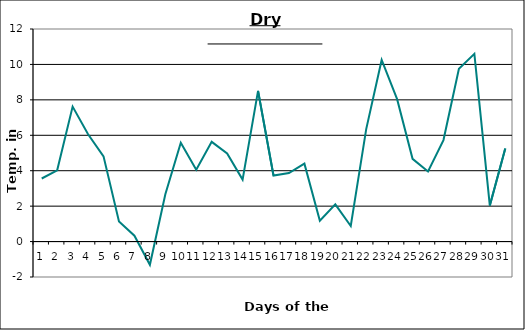
| Category | Series 0 |
|---|---|
| 0 | 3.56 |
| 1 | 4.02 |
| 2 | 7.62 |
| 3 | 6.06 |
| 4 | 4.81 |
| 5 | 1.13 |
| 6 | 0.33 |
| 7 | -1.31 |
| 8 | 2.67 |
| 9 | 5.58 |
| 10 | 4.05 |
| 11 | 5.63 |
| 12 | 4.97 |
| 13 | 3.5 |
| 14 | 8.51 |
| 15 | 3.73 |
| 16 | 3.87 |
| 17 | 4.4 |
| 18 | 1.18 |
| 19 | 2.1 |
| 20 | 0.88 |
| 21 | 6.35 |
| 22 | 10.25 |
| 23 | 8.04 |
| 24 | 4.67 |
| 25 | 3.96 |
| 26 | 5.73 |
| 27 | 9.75 |
| 28 | 10.6 |
| 29 | 2.03 |
| 30 | 5.26 |